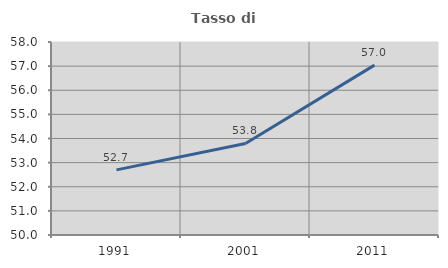
| Category | Tasso di occupazione   |
|---|---|
| 1991.0 | 52.7 |
| 2001.0 | 53.797 |
| 2011.0 | 57.041 |